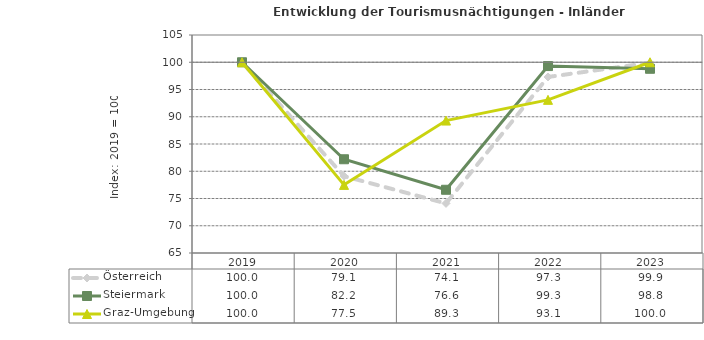
| Category | Österreich | Steiermark | Graz-Umgebung |
|---|---|---|---|
| 2023.0 | 99.9 | 98.8 | 100 |
| 2022.0 | 97.3 | 99.3 | 93.1 |
| 2021.0 | 74.1 | 76.6 | 89.3 |
| 2020.0 | 79.1 | 82.2 | 77.5 |
| 2019.0 | 100 | 100 | 100 |